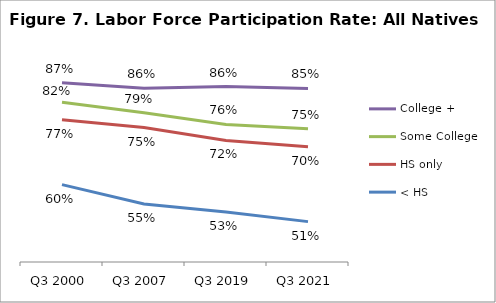
| Category | College + | Some College | HS only | < HS |
|---|---|---|---|---|
| Q3 2000 | 0.87 | 0.819 | 0.773 | 0.603 |
| Q3 2007 | 0.856 | 0.791 | 0.752 | 0.552 |
| Q3 2019 | 0.86 | 0.76 | 0.719 | 0.531 |
| Q3 2021 | 0.855 | 0.749 | 0.702 | 0.506 |